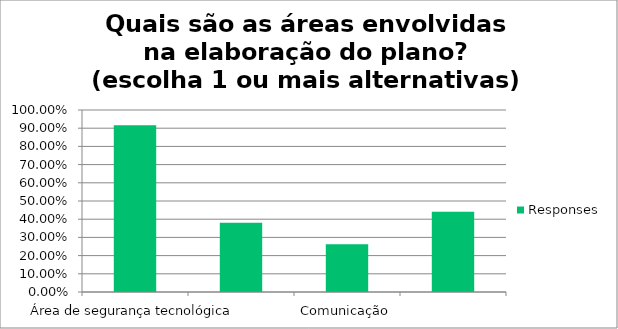
| Category | Responses |
|---|---|
| Área de segurança tecnológica | 0.917 |
| Departamento jurídico | 0.381 |
| Comunicação | 0.262 |
| Outros. Quais? | 0.44 |